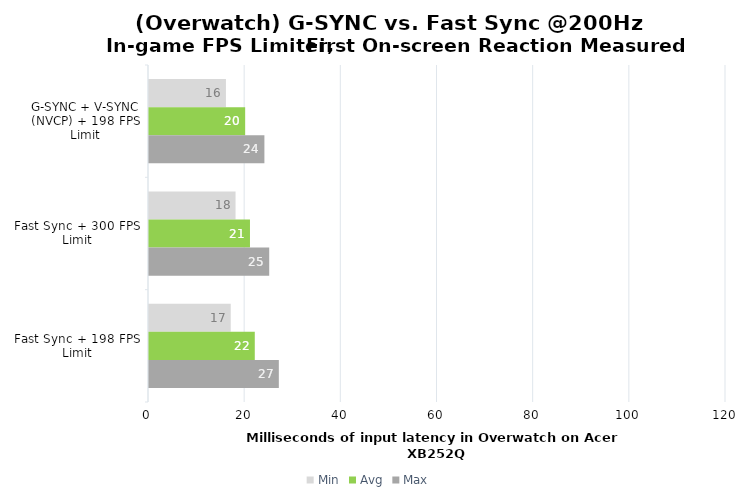
| Category | Min | Avg | Max |
|---|---|---|---|
| G-SYNC + V-SYNC (NVCP) + 198 FPS Limit | 16 | 20 | 24 |
| Fast Sync + 300 FPS Limit | 18 | 21 | 25 |
| Fast Sync + 198 FPS Limit | 17 | 22 | 27 |